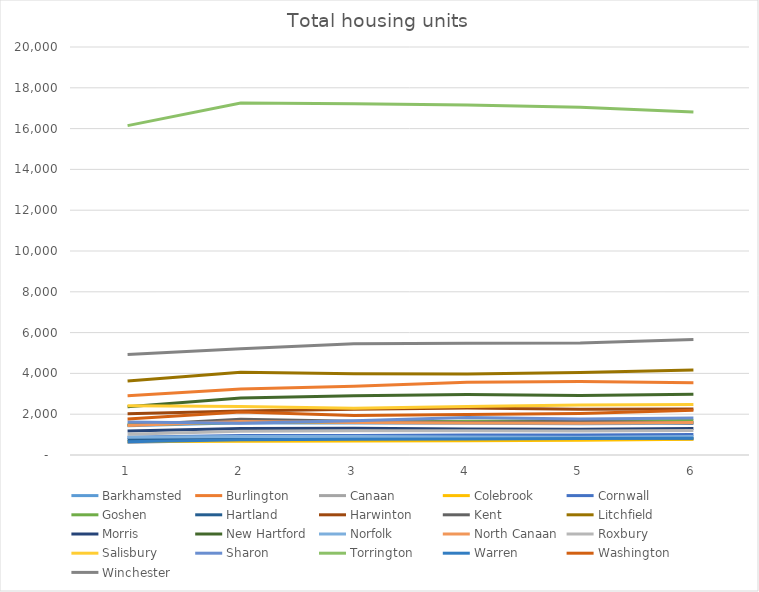
| Category | Barkhamsted | Burlington | Canaan | Colebrook | Cornwall | Goshen | Hartland | Harwinton | Kent | Litchfield | Morris | New Hartford | Norfolk | North Canaan | Roxbury | Salisbury | Sharon | Torrington | Warren | Washington | Winchester |
|---|---|---|---|---|---|---|---|---|---|---|---|---|---|---|---|---|---|---|---|---|---|
| 0 | 1436 | 2901 | 610 | 656 | 873 | 1482 | 759 | 2022 | 1463 | 3629 | 1181 | 2368 | 871 | 1444 | 1018 | 2410 | 1617 | 16147 | 650 | 1764 | 4922 |
| 1 | 1577 | 3238 | 746 | 675 | 958 | 1597 | 772 | 2156 | 1753 | 4055 | 1303 | 2798 | 912 | 1645 | 1165 | 2375 | 1562 | 17252 | 745 | 2105 | 5213 |
| 2 | 1572 | 3364 | 754 | 682 | 960 | 1609 | 816 | 2240 | 1654 | 3987 | 1314 | 2899 | 906 | 1592 | 1188 | 2293 | 1682 | 17220 | 770 | 1938 | 5449 |
| 3 | 1558 | 3572 | 755 | 701 | 976 | 1656 | 838 | 2299 | 1589 | 3965 | 1279 | 2965 | 880 | 1563 | 1185 | 2377 | 1843 | 17157 | 782 | 1984 | 5474 |
| 4 | 1537 | 3601 | 764 | 727 | 984 | 1679 | 847 | 2243 | 1660 | 4043 | 1266 | 2914 | 871 | 1556 | 1181 | 2446 | 1768 | 17047 | 803 | 2031 | 5486 |
| 5 | 1561 | 3541 | 772 | 773 | 1002 | 1694 | 824 | 2259 | 1574 | 4166 | 1294 | 2984 | 912 | 1596 | 1197 | 2478 | 1816 | 16812 | 819 | 2195 | 5661 |